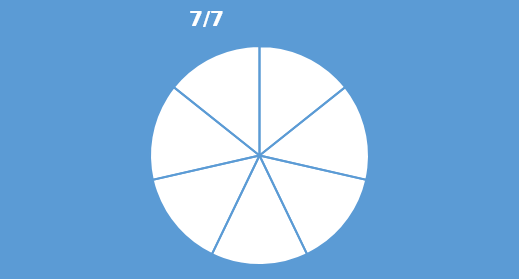
| Category | Series 0 |
|---|---|
| 0 | 0.143 |
| 1 | 0.143 |
| 2 | 0.143 |
| 3 | 0.143 |
| 4 | 0.143 |
| 5 | 0.143 |
| 6 | 0.143 |